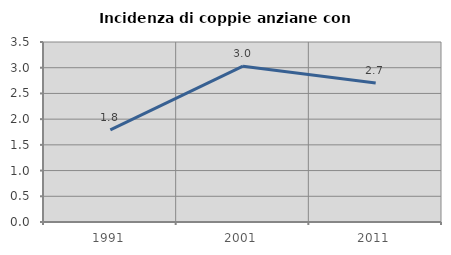
| Category | Incidenza di coppie anziane con figli |
|---|---|
| 1991.0 | 1.793 |
| 2001.0 | 3.03 |
| 2011.0 | 2.705 |